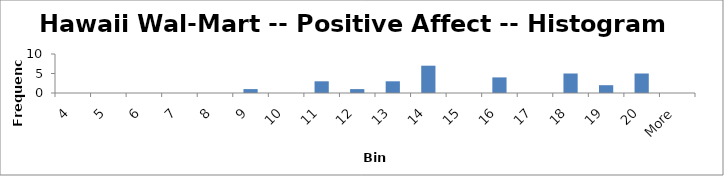
| Category | Frequency |
|---|---|
| 4 | 0 |
| 5 | 0 |
| 6 | 0 |
| 7 | 0 |
| 8 | 0 |
| 9 | 1 |
| 10 | 0 |
| 11 | 3 |
| 12 | 1 |
| 13 | 3 |
| 14 | 7 |
| 15 | 0 |
| 16 | 4 |
| 17 | 0 |
| 18 | 5 |
| 19 | 2 |
| 20 | 5 |
| More | 0 |